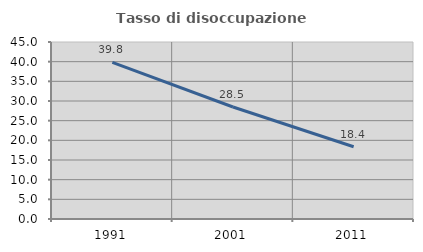
| Category | Tasso di disoccupazione giovanile  |
|---|---|
| 1991.0 | 39.809 |
| 2001.0 | 28.472 |
| 2011.0 | 18.367 |